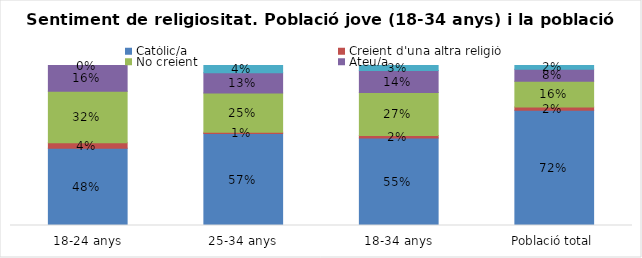
| Category | Catòlic/a | Creient d'una altra religió | No creient | Ateu/a | N.C. |
|---|---|---|---|---|---|
| 18-24 anys | 0.482 | 0.036 | 0.321 | 0.161 | 0 |
| 25-34 anys | 0.575 | 0.007 | 0.246 | 0.127 | 0.045 |
| 18-34 anys | 0.547 | 0.016 | 0.268 | 0.137 | 0.032 |
| Població total | 0.72 | 0.02 | 0.161 | 0.075 | 0.023 |